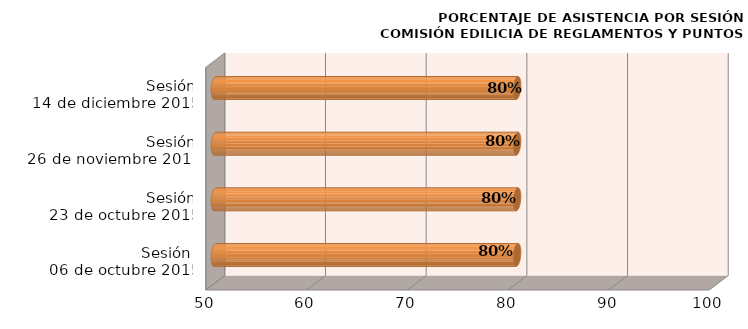
| Category | Series 0 |
|---|---|
| Sesión 
06 de octubre 2015 | 80 |
| Sesión
23 de octubre 2015 | 80 |
| Sesión
26 de noviembre 2015 | 80 |
| Sesión
14 de diciembre 2015 | 80 |